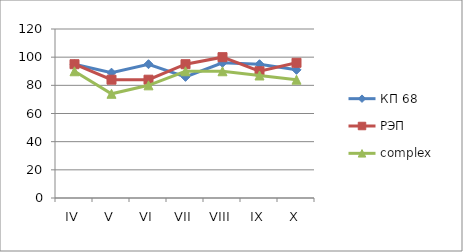
| Category | КП 68 | РЭП  | complex |
|---|---|---|---|
| IV | 95 | 95 | 90 |
| V | 89 | 84 | 74 |
| VI | 95 | 84 | 80 |
| VII | 86 | 95 | 90 |
| VIII | 96 | 100 | 90 |
| IX | 95 | 90 | 87 |
| X | 91 | 96 | 84 |